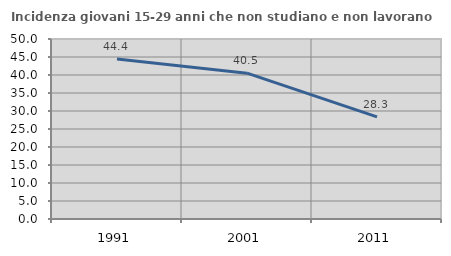
| Category | Incidenza giovani 15-29 anni che non studiano e non lavorano  |
|---|---|
| 1991.0 | 44.444 |
| 2001.0 | 40.504 |
| 2011.0 | 28.349 |